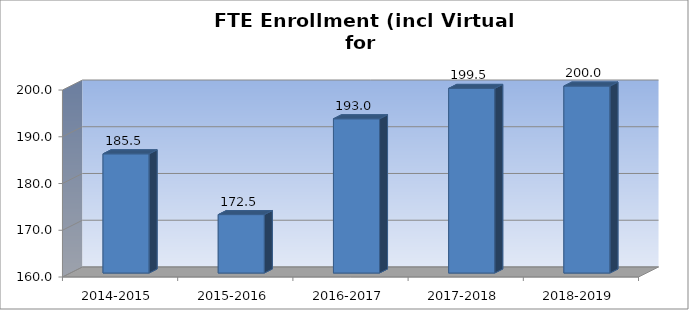
| Category | Enrollment FTE Used for Amount Per Pupil |
|---|---|
| 2014-2015 | 185.5 |
| 2015-2016 | 172.5 |
| 2016-2017 | 193 |
| 2017-2018 | 199.5 |
| 2018-2019 | 200 |